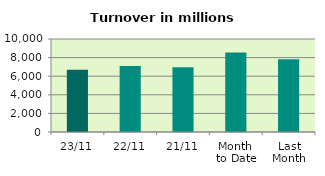
| Category | Series 0 |
|---|---|
| 23/11 | 6697.869 |
| 22/11 | 7084.231 |
| 21/11 | 6949.068 |
| Month 
to Date | 8542.568 |
| Last
Month | 7813.06 |